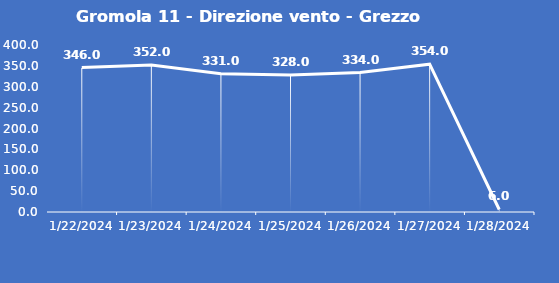
| Category | Gromola 11 - Direzione vento - Grezzo (°N) |
|---|---|
| 1/22/24 | 346 |
| 1/23/24 | 352 |
| 1/24/24 | 331 |
| 1/25/24 | 328 |
| 1/26/24 | 334 |
| 1/27/24 | 354 |
| 1/28/24 | 6 |